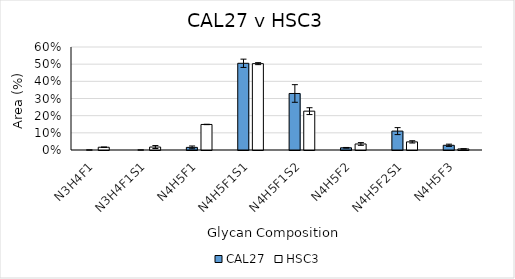
| Category | CAL27 | HSC3 |
|---|---|---|
| N3H4F1 | 0 | 0.016 |
| N3H4F1S1 | 0 | 0.017 |
| N4H5F1 | 0.015 | 0.149 |
| N4H5F1S1 | 0.505 | 0.503 |
| N4H5F1S2 | 0.329 | 0.226 |
| N4H5F2 | 0.013 | 0.035 |
| N4H5F2S1 | 0.11 | 0.047 |
| N4H5F3 | 0.027 | 0.006 |